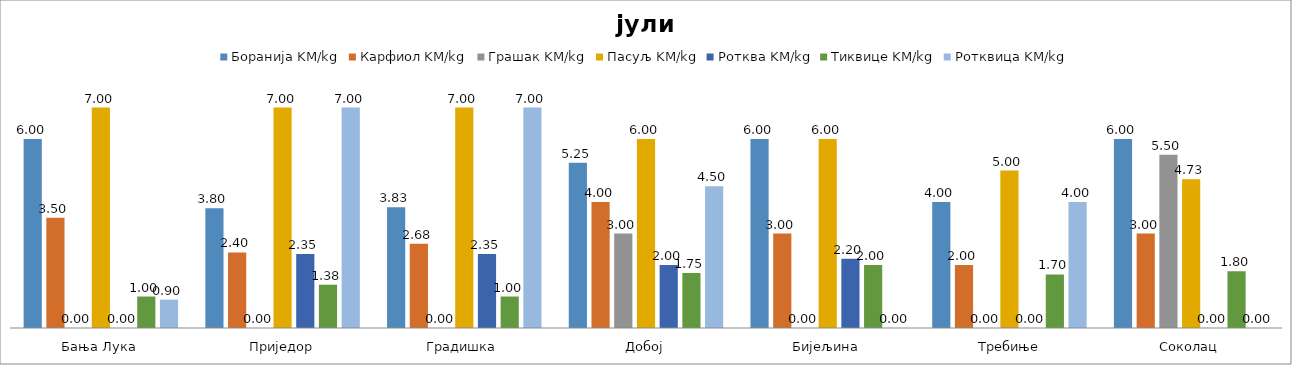
| Category | Боранија KM/kg | Карфиол KM/kg | Грашак KM/kg | Пасуљ KM/kg | Ротква KM/kg | Тиквице KM/kg | Ротквица KM/kg |
|---|---|---|---|---|---|---|---|
| Бања Лука | 6 | 3.5 | 0 | 7 | 0 | 1 | 0.9 |
| Приједор | 3.8 | 2.4 | 0 | 7 | 2.35 | 1.375 | 7 |
| Градишка | 3.833 | 2.675 | 0 | 7 | 2.35 | 1 | 7 |
| Добој | 5.25 | 4 | 3 | 6 | 2 | 1.75 | 4.5 |
| Бијељина | 6 | 3 | 0 | 6 | 2.2 | 2 | 0 |
|  Требиње | 4 | 2 | 0 | 5 | 0 | 1.7 | 4 |
| Соколац | 6 | 3 | 5.5 | 4.725 | 0 | 1.8 | 0 |